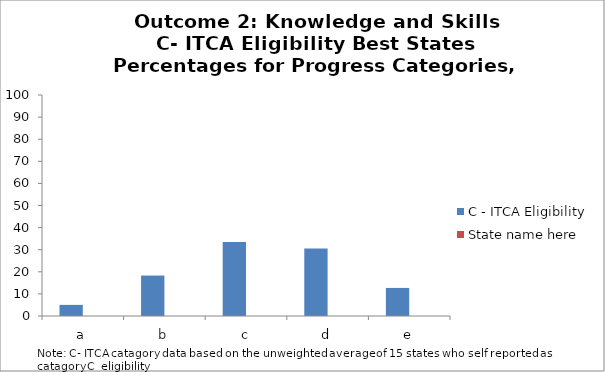
| Category | C - ITCA Eligibility | State name here |
|---|---|---|
| a | 5.03 |  |
| b | 18.3 |  |
| c | 33.5 |  |
| d | 30.5 |  |
| e | 12.7 |  |